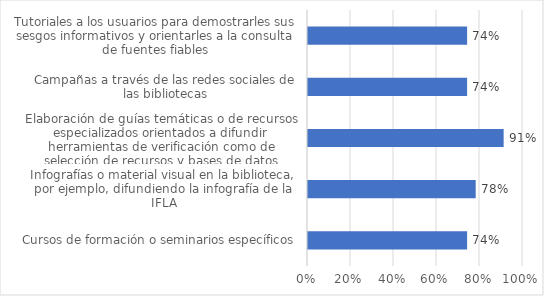
| Category | Series 0 |
|---|---|
| Cursos de formación o seminarios específicos | 0.74 |
| Infografías o material visual en la biblioteca, por ejemplo, difundiendo la infografía de la IFLA | 0.78 |
| Elaboración de guías temáticas o de recursos especializados orientados a difundir herramientas de verificación como de selección de recursos y bases de datos especializadas de prensa suscritas por la biblioteca | 0.91 |
| Campañas a través de las redes sociales de las bibliotecas | 0.74 |
| Tutoriales a los usuarios para demostrarles sus sesgos informativos y orientarles a la consulta de fuentes fiables | 0.74 |